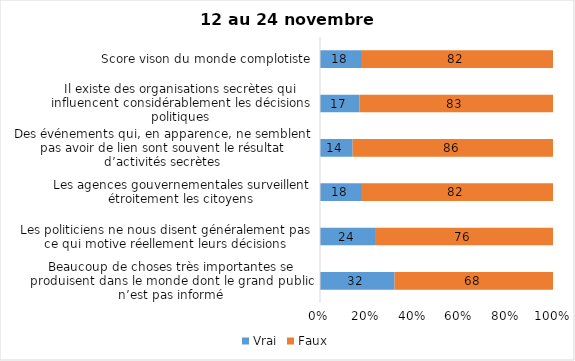
| Category | Vrai | Faux |
|---|---|---|
| Beaucoup de choses très importantes se produisent dans le monde dont le grand public n’est pas informé | 32 | 68 |
| Les politiciens ne nous disent généralement pas ce qui motive réellement leurs décisions | 24 | 76 |
| Les agences gouvernementales surveillent étroitement les citoyens | 18 | 82 |
| Des événements qui, en apparence, ne semblent pas avoir de lien sont souvent le résultat d’activités secrètes | 14 | 86 |
| Il existe des organisations secrètes qui influencent considérablement les décisions politiques | 17 | 83 |
| Score vison du monde complotiste | 18 | 82 |